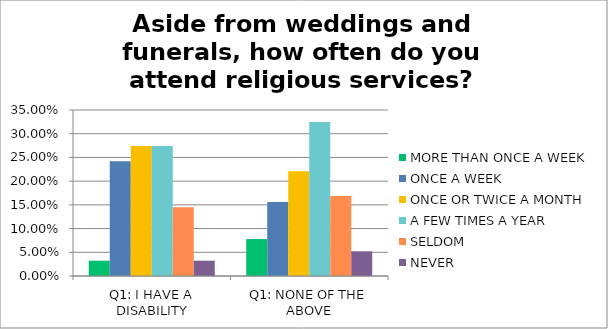
| Category | MORE THAN ONCE A WEEK | ONCE A WEEK | ONCE OR TWICE A MONTH | A FEW TIMES A YEAR | SELDOM | NEVER |
|---|---|---|---|---|---|---|
| Q1: I HAVE A DISABILITY | 0.032 | 0.242 | 0.274 | 0.274 | 0.145 | 0.032 |
| Q1: NONE OF THE ABOVE | 0.078 | 0.156 | 0.221 | 0.325 | 0.169 | 0.052 |